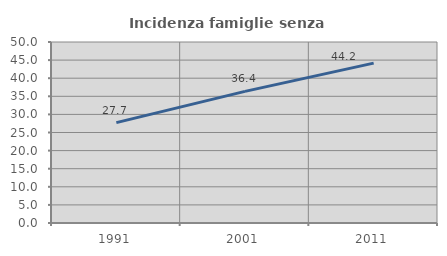
| Category | Incidenza famiglie senza nuclei |
|---|---|
| 1991.0 | 27.719 |
| 2001.0 | 36.364 |
| 2011.0 | 44.161 |